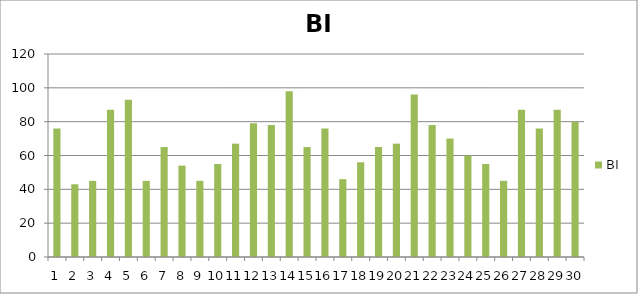
| Category | BI |
|---|---|
| 0 | 76 |
| 1 | 43 |
| 2 | 45 |
| 3 | 87 |
| 4 | 93 |
| 5 | 45 |
| 6 | 65 |
| 7 | 54 |
| 8 | 45 |
| 9 | 55 |
| 10 | 67 |
| 11 | 79 |
| 12 | 78 |
| 13 | 98 |
| 14 | 65 |
| 15 | 76 |
| 16 | 46 |
| 17 | 56 |
| 18 | 65 |
| 19 | 67 |
| 20 | 96 |
| 21 | 78 |
| 22 | 70 |
| 23 | 60 |
| 24 | 55 |
| 25 | 45 |
| 26 | 87 |
| 27 | 76 |
| 28 | 87 |
| 29 | 80 |